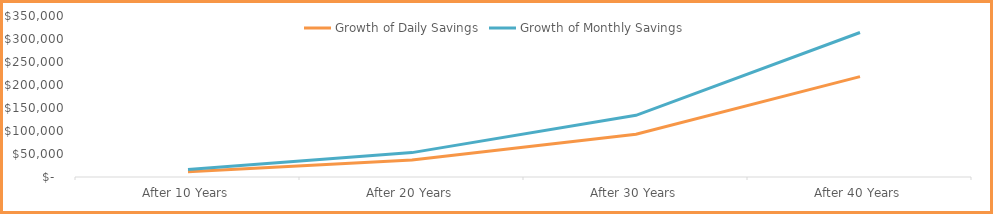
| Category | Growth of Daily Savings | Growth of Monthly Savings |
|---|---|---|
| After 10 Years | 11434.127 | 16465.143 |
| After 20 Years | 36813.776 | 53011.837 |
| After 30 Years | 93147.466 | 134132.35 |
| After 40 Years | 218187.989 | 314190.705 |